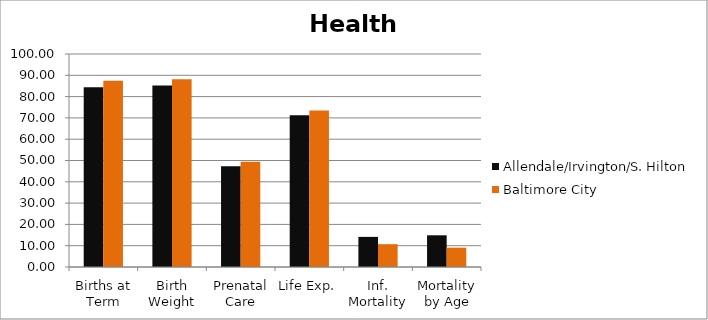
| Category | Allendale/Irvington/S. Hilton | Baltimore City |
|---|---|---|
| Births at Term | 84.375 | 87.494 |
| Birth Weight | 85.268 | 88.118 |
| Prenatal Care | 47.321 | 49.467 |
| Life Exp. | 71.3 | 73.5 |
| Inf. Mortality | 14.143 | 10.719 |
| Mortality by Age | 14.882 | 9.073 |